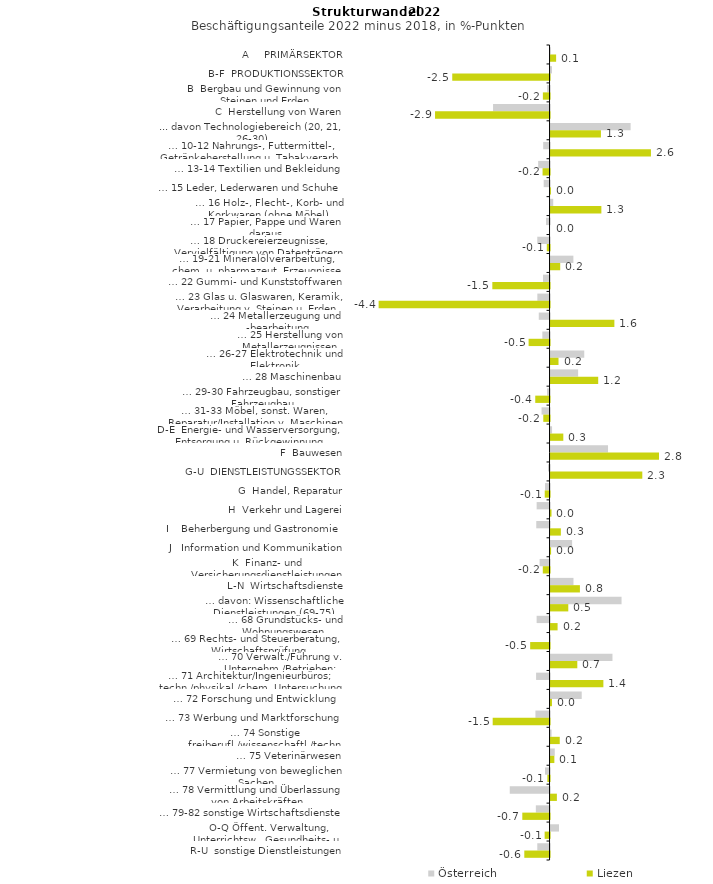
| Category | Österreich | Liezen |
|---|---|---|
| A     PRIMÄRSEKTOR | 0.004 | 0.142 |
| B-F  PRODUKTIONSSEKTOR | 0.036 | -2.488 |
| B  Bergbau und Gewinnung von Steinen und Erden | -0.063 | -0.171 |
| C  Herstellung von Waren | -1.445 | -2.928 |
| ... davon Technologiebereich (20, 21, 26-30) | 2.047 | 1.288 |
| … 10-12 Nahrungs-, Futtermittel-, Getränkeherstellung u. Tabakverarb. | -0.163 | 2.567 |
| … 13-14 Textilien und Bekleidung | -0.292 | -0.179 |
| … 15 Leder, Lederwaren und Schuhe | -0.15 | 0.009 |
| … 16 Holz-, Flecht-, Korb- und Korkwaren (ohne Möbel)  | 0.068 | 1.299 |
| … 17 Papier, Pappe und Waren daraus  | -0.09 | 0 |
| … 18 Druckereierzeugnisse, Vervielfältigung von Datenträgern | -0.314 | -0.07 |
| … 19-21 Mineralölverarbeitung, chem. u. pharmazeut. Erzeugnisse | 0.584 | 0.247 |
| … 22 Gummi- und Kunststoffwaren | -0.168 | -1.463 |
| … 23 Glas u. Glaswaren, Keramik, Verarbeitung v. Steinen u. Erden  | -0.312 | -4.37 |
| … 24 Metallerzeugung und -bearbeitung | -0.276 | 1.632 |
| … 25 Herstellung von Metallerzeugnissen  | -0.185 | -0.536 |
| … 26-27 Elektrotechnik und Elektronik | 0.862 | 0.203 |
| … 28 Maschinenbau | 0.705 | 1.218 |
| … 29-30 Fahrzeugbau, sonstiger Fahrzeugbau | -0.066 | -0.366 |
| … 31-33 Möbel, sonst. Waren, Reparatur/Installation v. Maschinen | -0.204 | -0.161 |
| D-E  Energie- und Wasserversorgung, Entsorgung u. Rückgewinnung | 0.038 | 0.326 |
| F  Bauwesen | 1.469 | 2.773 |
| G-U  DIENSTLEISTUNGSSEKTOR | -0.04 | 2.346 |
| G  Handel, Reparatur | -0.115 | -0.123 |
| H  Verkehr und Lagerei | -0.33 | 0.024 |
| I    Beherbergung und Gastronomie | -0.34 | 0.264 |
| J   Information und Kommunikation | 0.551 | 0.013 |
| K  Finanz- und Versicherungsdienstleistungen | -0.255 | -0.173 |
| L-N  Wirtschaftsdienste | 0.586 | 0.751 |
| … davon: Wissenschaftliche Dienstleistungen (69-75) | 1.815 | 0.453 |
| … 68 Grundstücks- und Wohnungswesen  | -0.331 | 0.18 |
| … 69 Rechts- und Steuerberatung, Wirtschaftsprüfung | 0.008 | -0.496 |
| … 70 Verwalt./Führung v. Unternehm./Betrieben; Unternehmensberat. | 1.583 | 0.684 |
| … 71 Architektur/Ingenieurbüros; techn./physikal./chem. Untersuchung | -0.344 | 1.351 |
| … 72 Forschung und Entwicklung  | 0.797 | 0.036 |
| … 73 Werbung und Marktforschung | -0.361 | -1.454 |
| … 74 Sonstige freiberufl./wissenschaftl./techn. Tätigkeiten | 0.025 | 0.235 |
| … 75 Veterinärwesen | 0.108 | 0.097 |
| … 77 Vermietung von beweglichen Sachen  | -0.116 | -0.056 |
| … 78 Vermittlung und Überlassung von Arbeitskräften | -1.018 | 0.162 |
| … 79-82 sonstige Wirtschaftsdienste | -0.351 | -0.697 |
| O-Q Öffent. Verwaltung, Unterrichtsw., Gesundheits- u. Sozialwesen | 0.216 | -0.126 |
| R-U  sonstige Dienstleistungen | -0.314 | -0.646 |